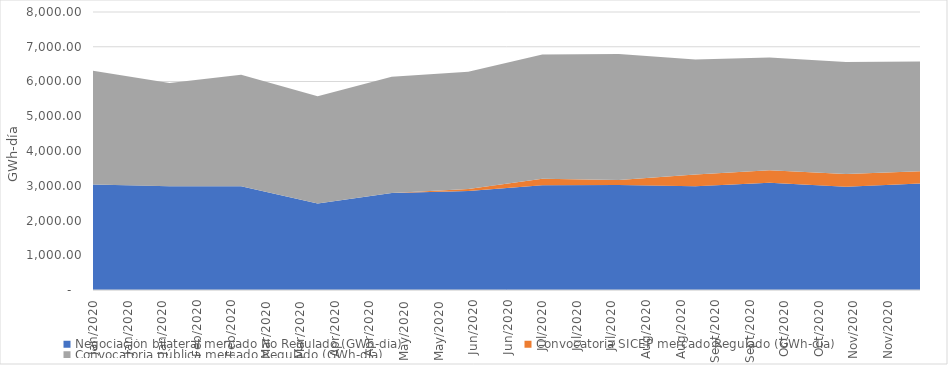
| Category | Negociación bilateral mercado No Regulado (GWh-día) | Convocatoria SICEP mercado Regulado (GWh-día) | Convocatoria pública mercado Regulado (GWh-día) |
|---|---|---|---|
| 2020-01-01 | 3036.517 | 0 | 3272.249 |
| 2020-02-01 | 2987.295 | 0 | 2969.322 |
| 2020-03-01 | 2983.903 | 0 | 3208.635 |
| 2020-04-01 | 2490.426 | 0 | 3086.867 |
| 2020-05-01 | 2793.233 | 0 | 3342.02 |
| 2020-06-01 | 2850.383 | 58.53 | 3368.769 |
| 2020-07-01 | 3017.164 | 181.656 | 3581.506 |
| 2020-08-01 | 3018.39 | 146.396 | 3627.992 |
| 2020-09-01 | 2985.973 | 338.025 | 3307.115 |
| 2020-10-01 | 3083.684 | 362.657 | 3244.391 |
| 2020-11-01 | 2973.174 | 365.371 | 3225.702 |
| 2020-12-01 | 3067.559 | 346.384 | 3163.246 |